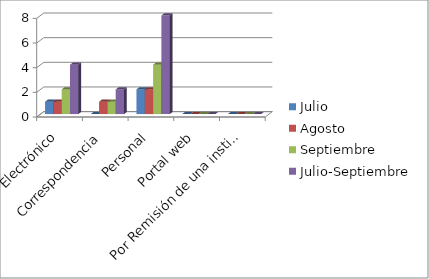
| Category | Julio | Agosto | Septiembre | Julio-Septiembre |
|---|---|---|---|---|
| Correo Electrónico | 1 | 1 | 2 | 4 |
| Correspondencia | 0 | 1 | 1 | 2 |
| Personal | 2 | 2 | 4 | 8 |
| Portal web | 0 | 0 | 0 | 0 |
| Por Remisión de una institución | 0 | 0 | 0 | 0 |